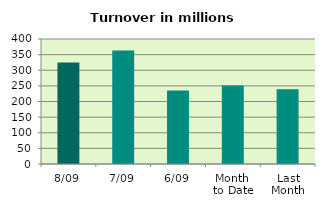
| Category | Series 0 |
|---|---|
| 8/09 | 325.159 |
| 7/09 | 362.97 |
| 6/09 | 235.204 |
| Month 
to Date | 251.499 |
| Last
Month | 239.159 |